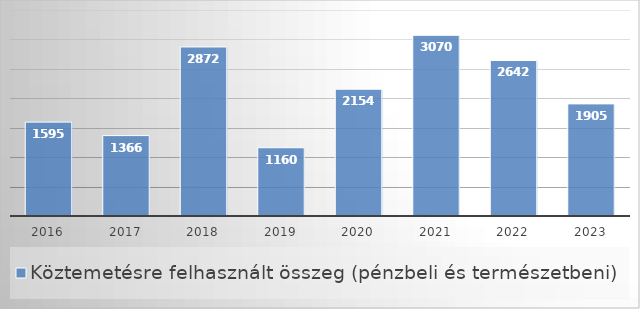
| Category | Köztemetésre felhasznált összeg (pénzbeli és természetbeni)   (eFt) |
|---|---|
| 2016.0 | 1595 |
| 2017.0 | 1366 |
| 2018.0 | 2872 |
| 2019.0 | 1160 |
| 2020.0 | 2154 |
| 2021.0 | 3070 |
| 2022.0 | 2642 |
| 2023.0 | 1905 |